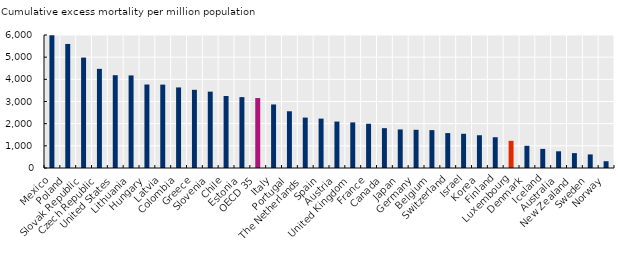
| Category | Cumulative excess mortality per million population
 |
|---|---|
| Mexico | 5988.744 |
| Poland | 5596.125 |
| Slovak Republic | 4981.538 |
| Czech Republic | 4473.029 |
| United States | 4186.355 |
| Lithuania | 4176.637 |
| Hungary | 3766.785 |
| Latvia | 3761.123 |
| Colombia | 3634.792 |
| Greece | 3527.151 |
| Slovenia | 3444.98 |
| Chile | 3247.8 |
| Estonia | 3197.725 |
| OECD 35 | 3155.807 |
| Italy | 2866.372 |
| Portugal | 2559.123 |
| The Netherlands | 2274.095 |
| Spain | 2227.887 |
| Austria | 2095.064 |
| United Kingdom | 2056.938 |
| France | 1995.949 |
| Canada | 1797.672 |
| Japan | 1739.995 |
| Germany | 1723.572 |
| Belgium | 1708.596 |
| Switzerland | 1575.139 |
| Israel | 1543.716 |
| Korea | 1478.397 |
| Finland | 1388.705 |
| Luxembourg | 1226.466 |
| Denmark | 1002.205 |
| Iceland | 862.045 |
| Australia | 753.666 |
| New Zealand | 671.515 |
| Sweden | 612.641 |
| Norway | 306.041 |